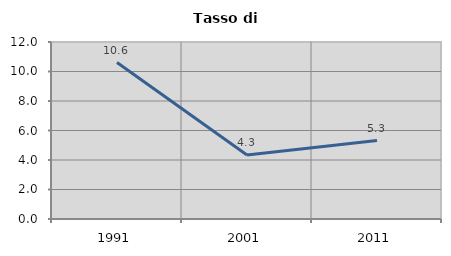
| Category | Tasso di disoccupazione   |
|---|---|
| 1991.0 | 10.608 |
| 2001.0 | 4.342 |
| 2011.0 | 5.316 |